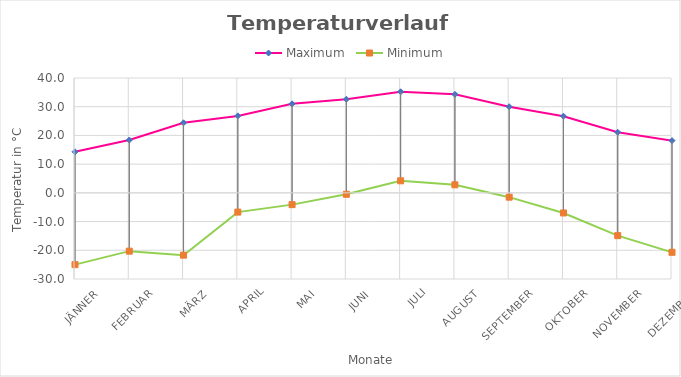
| Category | Maximum | Minimum |
|---|---|---|
| Jänner | 14.3 | -25 |
| Februar | 18.4 | -20.3 |
| März | 24.4 | -21.7 |
| April | 26.8 | -6.7 |
| Mai | 31 | -4.1 |
| Juni | 32.6 | -0.5 |
| Juli | 35.2 | 4.2 |
| August | 34.3 | 2.8 |
| September | 30 | -1.5 |
| Oktober | 26.7 | -7 |
| November | 21.1 | -14.9 |
| Dezember | 18.2 | -20.7 |